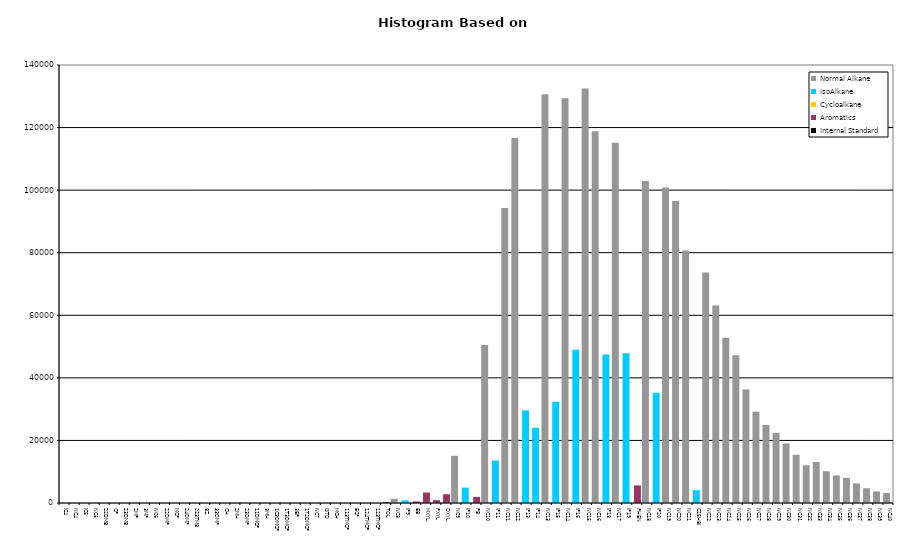
| Category | Normal Alkane | IsoAlkane | Cycloalkane | Aromatics | Internal Standard |
|---|---|---|---|---|---|
| IC4 | 0 | 0 | 0 | 0 | 0 |
| NC4 | 0 | 0 | 0 | 0 | 0 |
| IC5 | 0 | 0 | 0 | 0 | 0 |
| NC5 | 0 | 0 | 0 | 0 | 0 |
| 22DMB | 0 | 0 | 0 | 0 | 0 |
| CP | 0 | 0 | 0 | 0 | 0 |
| 23DMB | 0 | 0 | 0 | 0 | 0 |
| 2MP | 0 | 0 | 0 | 0 | 0 |
| 3MP | 0 | 0 | 0 | 0 | 0 |
| NC6 | 0 | 0 | 0 | 0 | 0 |
| 22DMP | 0 | 0 | 0 | 0 | 0 |
| MCP | 0 | 0 | 0 | 0 | 0 |
| 24DMP | 0 | 0 | 0 | 0 | 0 |
| 223TMB | 0 | 0 | 0 | 0 | 0 |
| BZ | 0 | 0 | 0 | 0 | 0 |
| 33DMP | 0 | 0 | 0 | 0 | 0 |
| CH | 0 | 0 | 0 | 0 | 0 |
| 2MH | 0 | 0 | 0 | 0 | 0 |
| 23DMP | 0 | 0 | 0 | 0 | 0 |
| 11DMCP | 0 | 0 | 0 | 0 | 0 |
| 3MH | 0 | 0 | 0 | 0 | 0 |
| 1C3DMCP | 0 | 0 | 0 | 0 | 0 |
| 1T3DMCP | 0 | 0 | 0 | 0 | 0 |
| 3EP | 0 | 0 | 0 | 0 | 0 |
| 1T2DMCP | 0 | 0 | 0 | 0 | 0 |
| NC7 | 0 | 0 | 0 | 0 | 0 |
| ISTD | 0 | 0 | 0 | 0 | 0 |
| MCH | 0 | 0 | 73 | 0 | 0 |
| 113TMCP | 0 | 0 | 0 | 0 | 0 |
| ECP | 0 | 0 | 0 | 0 | 0 |
| 124TMCP | 0 | 0 | 0 | 0 | 0 |
| 123TMCP | 0 | 0 | 30 | 0 | 0 |
| TOL | 0 | 0 | 0 | 314 | 0 |
| NC8 | 1352 | 0 | 0 | 0 | 0 |
| IP9 | 0 | 844 | 0 | 0 | 0 |
| EB | 0 | 0 | 0 | 508 | 0 |
| MXYL | 0 | 0 | 0 | 3351 | 0 |
| PXYL | 0 | 0 | 0 | 911 | 0 |
| OXYL | 0 | 0 | 0 | 2794 | 0 |
| NC9 | 15082 | 0 | 0 | 0 | 0 |
| IP10 | 0 | 4910 | 0 | 0 | 0 |
| PB | 0 | 0 | 0 | 1954 | 0 |
| NC10 | 50473 | 0 | 0 | 0 | 0 |
| IP11 | 0 | 13570 | 0 | 0 | 0 |
| NC11 | 94279 | 0 | 0 | 0 | 0 |
| NC12 | 116653 | 0 | 0 | 0 | 0 |
| IP13 | 0 | 29602 | 0 | 0 | 0 |
| IP14 | 0 | 24063 | 0 | 0 | 0 |
| NC13 | 130687 | 0 | 0 | 0 | 0 |
| IP15 | 0 | 32359 | 0 | 0 | 0 |
| NC14 | 129381 | 0 | 0 | 0 | 0 |
| IP16 | 0 | 48947 | 0 | 0 | 0 |
| NC15 | 132456 | 0 | 0 | 0 | 0 |
| NC16 | 118788 | 0 | 0 | 0 | 0 |
| IP18 | 0 | 47486 | 0 | 0 | 0 |
| NC17 | 115148 | 0 | 0 | 0 | 0 |
| IP19 | 0 | 47862 | 0 | 0 | 0 |
| PHEN | 0 | 0 | 0 | 5619 | 0 |
| NC18 | 102904 | 0 | 0 | 0 | 0 |
| IP20 | 0 | 35237 | 0 | 0 | 0 |
| NC19 | 100843 | 0 | 0 | 0 | 0 |
| NC20 | 96522 | 0 | 0 | 0 | 0 |
| NC21 | 80668 | 0 | 0 | 0 | 0 |
| C25HBI | 0 | 4116 | 0 | 0 | 0 |
| NC22 | 73672 | 0 | 0 | 0 | 0 |
| NC23 | 63095 | 0 | 0 | 0 | 0 |
| NC24 | 52832 | 0 | 0 | 0 | 0 |
| NC25 | 47238 | 0 | 0 | 0 | 0 |
| NC26 | 36270 | 0 | 0 | 0 | 0 |
| NC27 | 29174 | 0 | 0 | 0 | 0 |
| NC28 | 24935 | 0 | 0 | 0 | 0 |
| NC29 | 22377 | 0 | 0 | 0 | 0 |
| NC30 | 19042 | 0 | 0 | 0 | 0 |
| NC31 | 15419 | 0 | 0 | 0 | 0 |
| NC32 | 12048 | 0 | 0 | 0 | 0 |
| NC33 | 13117 | 0 | 0 | 0 | 0 |
| NC34 | 10155 | 0 | 0 | 0 | 0 |
| NC35 | 8815 | 0 | 0 | 0 | 0 |
| NC36 | 8041 | 0 | 0 | 0 | 0 |
| NC37 | 6271 | 0 | 0 | 0 | 0 |
| NC38 | 4710 | 0 | 0 | 0 | 0 |
| NC39 | 3712 | 0 | 0 | 0 | 0 |
| NC40 | 3190 | 0 | 0 | 0 | 0 |